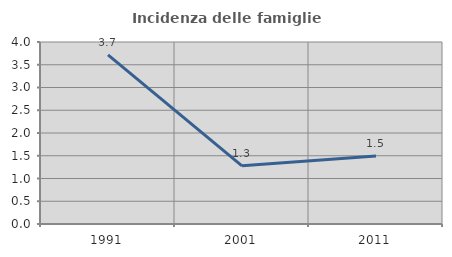
| Category | Incidenza delle famiglie numerose |
|---|---|
| 1991.0 | 3.717 |
| 2001.0 | 1.278 |
| 2011.0 | 1.497 |